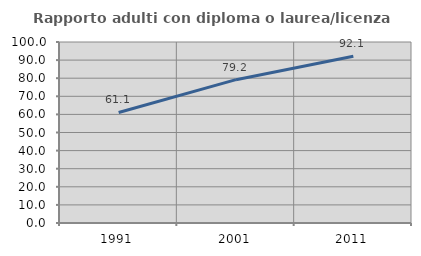
| Category | Rapporto adulti con diploma o laurea/licenza media  |
|---|---|
| 1991.0 | 61.053 |
| 2001.0 | 79.195 |
| 2011.0 | 92.09 |